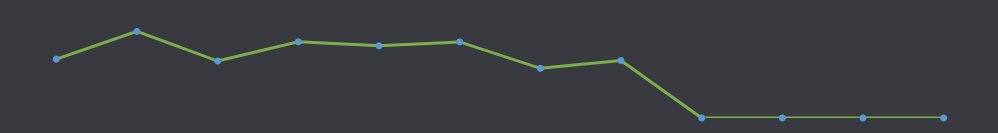
| Category | Beschikbaar geld |
|---|---|
| JAN | 800 |
| FEB | 1177 |
| MRT | 774 |
| APR | 1035 |
| MEI | 981 |
| JUN | 1034 |
| JUL | 675 |
| AUG | 781 |
| SEP | 0 |
| OKT | 0 |
| NOV | 0 |
| DEC | 0 |